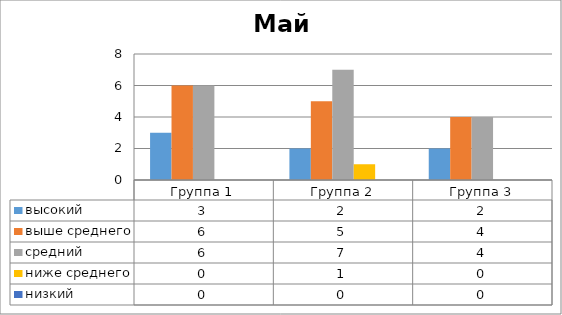
| Category | высокий | выше среднего | средний | ниже среднего | низкий |
|---|---|---|---|---|---|
| Группа 1 | 3 | 6 | 6 | 0 | 0 |
| Группа 2 | 2 | 5 | 7 | 1 | 0 |
| Группа 3 | 2 | 4 | 4 | 0 | 0 |